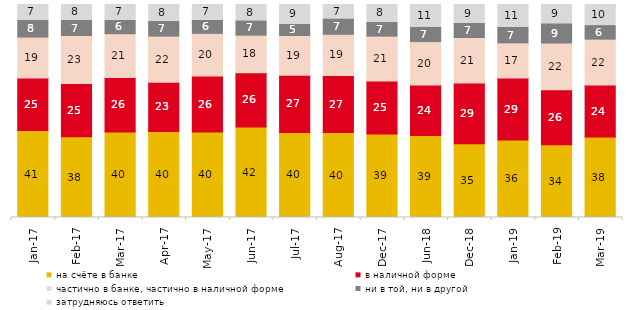
| Category | на счёте в банке | в наличной форме | частично в банке, частично в наличной форме | ни в той, ни в другой | затрудняюсь ответить |
|---|---|---|---|---|---|
| 2017-01-01 | 40.8 | 24.65 | 19.25 | 7.95 | 7.35 |
| 2017-02-01 | 37.9 | 25 | 22.5 | 7.1 | 7.5 |
| 2017-03-01 | 40.1 | 25.65 | 20.55 | 6.3 | 7.4 |
| 2017-04-01 | 40.4 | 23.05 | 21.7 | 6.95 | 7.9 |
| 2017-05-01 | 40.1 | 26.3 | 20.05 | 6.15 | 7.4 |
| 2017-06-01 | 42.45 | 25.5 | 17.65 | 6.75 | 7.65 |
| 2017-07-01 | 39.95 | 26.8 | 18.7 | 5.3 | 9.25 |
| 2017-08-01 | 39.85 | 26.8 | 19.35 | 7.25 | 6.75 |
| 2017-12-01 | 39.2 | 24.85 | 21.05 | 6.55 | 8.3 |
| 2018-06-01 | 38.5 | 23.65 | 20.45 | 6.8 | 10.6 |
| 2018-12-01 | 34.6 | 28.55 | 21.35 | 6.65 | 8.85 |
| 2019-01-01 | 36.35 | 29.1 | 16.55 | 7.35 | 10.65 |
| 2019-02-01 | 34.2 | 25.75 | 22 | 9.05 | 9 |
| 2019-03-01 | 37.842 | 24.316 | 21.581 | 6.365 | 9.896 |